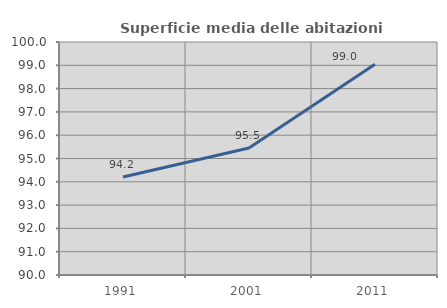
| Category | Superficie media delle abitazioni occupate |
|---|---|
| 1991.0 | 94.206 |
| 2001.0 | 95.45 |
| 2011.0 | 99.043 |